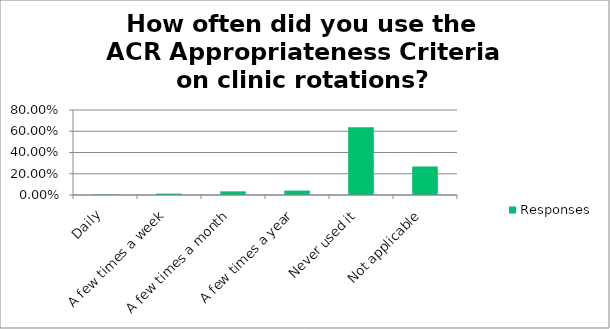
| Category | Responses |
|---|---|
| Daily | 0.004 |
| A few times a week | 0.013 |
| A few times a month | 0.034 |
| A few times a year | 0.042 |
| Never used it | 0.639 |
| Not applicable | 0.268 |